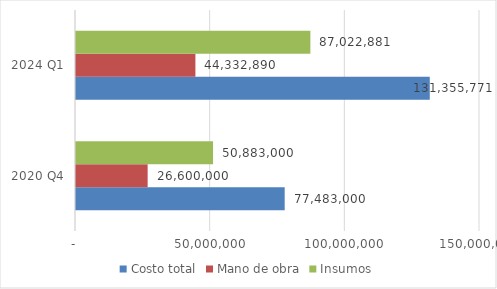
| Category | Costo total | Mano de obra | Insumos |
|---|---|---|---|
| 2020 Q4 | 77483000 | 26600000 | 50883000 |
| 2024 Q1 | 131355771.351 | 44332890 | 87022881.351 |